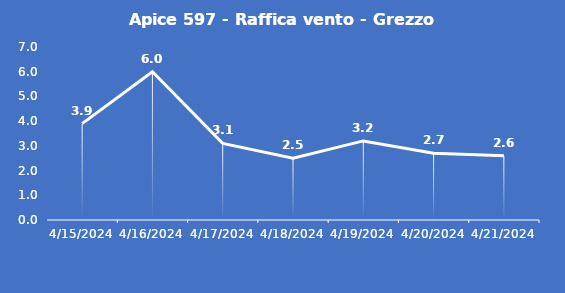
| Category | Apice 597 - Raffica vento - Grezzo (m/s) |
|---|---|
| 4/15/24 | 3.9 |
| 4/16/24 | 6 |
| 4/17/24 | 3.1 |
| 4/18/24 | 2.5 |
| 4/19/24 | 3.2 |
| 4/20/24 | 2.7 |
| 4/21/24 | 2.6 |